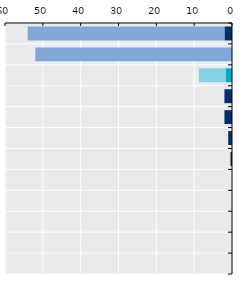
| Category | Series 0 | Father-specific parental and homecare leave |
|---|---|---|
| Korea | 2 | 52 |
| Japan | 0 | 52 |
| OECD average | 1.707 | 7.005 |
| Australia | 2 | 0 |
| Singapore* | 2 | 0 |
| Viet Nam* | 1 | 0 |
| Indonesia* | 0.4 | 0 |
| New Zealand | 0 | 0 |
| Mongolia* | 0 | 0 |
| Thailand* | 0 | 0 |
| China | 0 | 0 |
| Malaysia* | 0 | 0 |